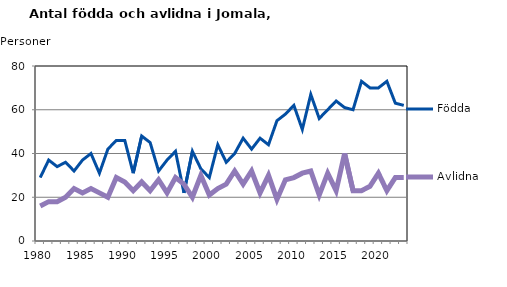
| Category | Födda | Avlidna |
|---|---|---|
| 1980.0 | 29 | 16 |
| 1981.0 | 37 | 18 |
| 1982.0 | 34 | 18 |
| 1983.0 | 36 | 20 |
| 1984.0 | 32 | 24 |
| 1985.0 | 37 | 22 |
| 1986.0 | 40 | 24 |
| 1987.0 | 31 | 22 |
| 1988.0 | 42 | 20 |
| 1989.0 | 46 | 29 |
| 1990.0 | 46 | 27 |
| 1991.0 | 31 | 23 |
| 1992.0 | 48 | 27 |
| 1993.0 | 45 | 23 |
| 1994.0 | 32 | 28 |
| 1995.0 | 37 | 22 |
| 1996.0 | 41 | 29 |
| 1997.0 | 22 | 26 |
| 1998.0 | 41 | 20 |
| 1999.0 | 33 | 30 |
| 2000.0 | 29 | 21 |
| 2001.0 | 44 | 24 |
| 2002.0 | 36 | 26 |
| 2003.0 | 40 | 32 |
| 2004.0 | 47 | 26 |
| 2005.0 | 42 | 32 |
| 2006.0 | 47 | 22 |
| 2007.0 | 44 | 30 |
| 2008.0 | 55 | 19 |
| 2009.0 | 58 | 28 |
| 2010.0 | 62 | 29 |
| 2011.0 | 51 | 31 |
| 2012.0 | 67 | 32 |
| 2013.0 | 56 | 21 |
| 2014.0 | 60 | 31 |
| 2015.0 | 64 | 23 |
| 2016.0 | 61 | 40 |
| 2017.0 | 60 | 23 |
| 2018.0 | 73 | 23 |
| 2019.0 | 70 | 25 |
| 2020.0 | 70 | 31 |
| 2021.0 | 73 | 23 |
| 2022.0 | 63 | 29 |
| 2023.0 | 62 | 29 |